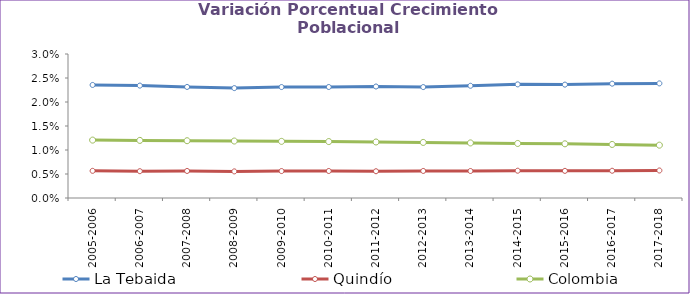
| Category | La Tebaida | Quindío | Colombia |
|---|---|---|---|
| 2005-2006 | 0.024 | 0.006 | 0.012 |
| 2006-2007 | 0.023 | 0.006 | 0.012 |
| 2007-2008 | 0.023 | 0.006 | 0.012 |
| 2008-2009 | 0.023 | 0.006 | 0.012 |
| 2009-2010 | 0.023 | 0.006 | 0.012 |
| 2010-2011 | 0.023 | 0.006 | 0.012 |
| 2011-2012 | 0.023 | 0.006 | 0.012 |
| 2012-2013 | 0.023 | 0.006 | 0.012 |
| 2013-2014 | 0.023 | 0.006 | 0.011 |
| 2014-2015 | 0.024 | 0.006 | 0.011 |
| 2015-2016 | 0.024 | 0.006 | 0.011 |
| 2016-2017 | 0.024 | 0.006 | 0.011 |
| 2017-2018 | 0.024 | 0.006 | 0.011 |